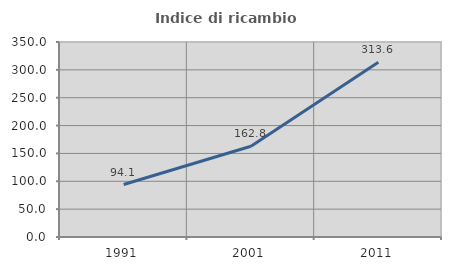
| Category | Indice di ricambio occupazionale  |
|---|---|
| 1991.0 | 94.143 |
| 2001.0 | 162.835 |
| 2011.0 | 313.632 |